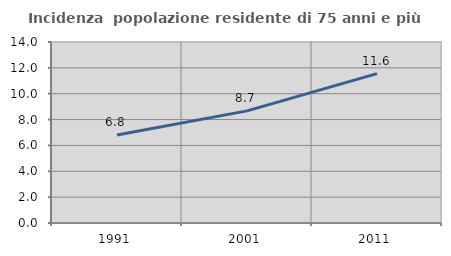
| Category | Incidenza  popolazione residente di 75 anni e più |
|---|---|
| 1991.0 | 6.814 |
| 2001.0 | 8.673 |
| 2011.0 | 11.552 |